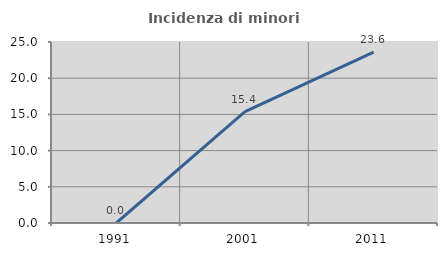
| Category | Incidenza di minori stranieri |
|---|---|
| 1991.0 | 0 |
| 2001.0 | 15.385 |
| 2011.0 | 23.602 |